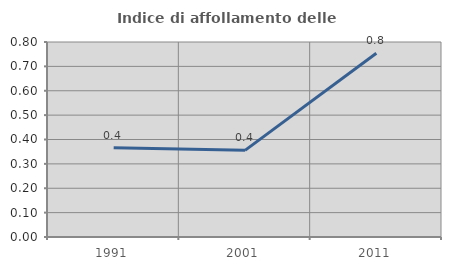
| Category | Indice di affollamento delle abitazioni  |
|---|---|
| 1991.0 | 0.366 |
| 2001.0 | 0.355 |
| 2011.0 | 0.754 |